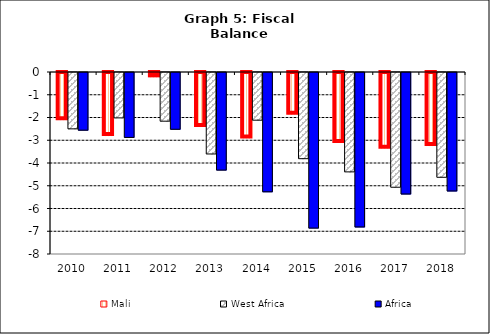
| Category | Mali | West Africa | Africa |
|---|---|---|---|
| 2010.0 | -2.074 | -2.477 | -2.535 |
| 2011.0 | -2.774 | -1.995 | -2.853 |
| 2012.0 | -0.192 | -2.14 | -2.495 |
| 2013.0 | -2.371 | -3.581 | -4.291 |
| 2014.0 | -2.878 | -2.096 | -5.245 |
| 2015.0 | -1.831 | -3.788 | -6.84 |
| 2016.0 | -3.076 | -4.368 | -6.79 |
| 2017.0 | -3.326 | -5.043 | -5.342 |
| 2018.0 | -3.213 | -4.606 | -5.208 |